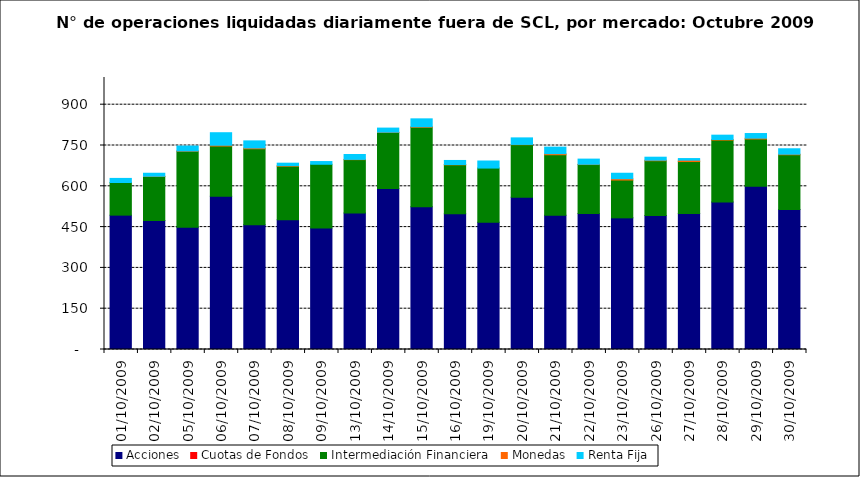
| Category | Acciones | Cuotas de Fondos | Intermediación Financiera | Monedas | Renta Fija |
|---|---|---|---|---|---|
| 01/10/2009 | 494 | 0 | 120 | 0 | 15 |
| 02/10/2009 | 474 | 0 | 162 | 1 | 11 |
| 05/10/2009 | 449 | 0 | 280 | 1 | 18 |
| 06/10/2009 | 563 | 0 | 185 | 3 | 46 |
| 07/10/2009 | 459 | 0 | 279 | 3 | 26 |
| 08/10/2009 | 477 | 0 | 197 | 2 | 9 |
| 09/10/2009 | 447 | 0 | 234 | 0 | 10 |
| 13/10/2009 | 502 | 0 | 196 | 1 | 18 |
| 14/10/2009 | 592 | 0 | 206 | 1 | 15 |
| 15/10/2009 | 525 | 0 | 292 | 2 | 29 |
| 16/10/2009 | 499 | 0 | 180 | 1 | 15 |
| 19/10/2009 | 468 | 0 | 199 | 0 | 26 |
| 20/10/2009 | 560 | 0 | 193 | 1 | 24 |
| 21/10/2009 | 494 | 0 | 222 | 4 | 24 |
| 22/10/2009 | 500 | 0 | 180 | 1 | 19 |
| 23/10/2009 | 484 | 0 | 139 | 5 | 20 |
| 26/10/2009 | 493 | 0 | 201 | 2 | 11 |
| 27/10/2009 | 500 | 0 | 191 | 5 | 6 |
| 28/10/2009 | 542 | 0 | 228 | 2 | 16 |
| 29/10/2009 | 600 | 0 | 174 | 3 | 17 |
| 30/10/2009 | 515 | 0 | 201 | 2 | 20 |